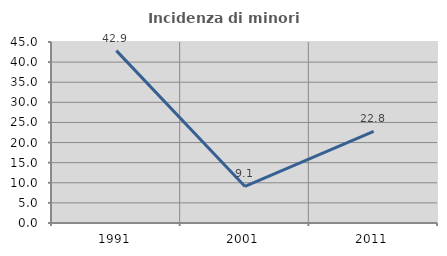
| Category | Incidenza di minori stranieri |
|---|---|
| 1991.0 | 42.857 |
| 2001.0 | 9.091 |
| 2011.0 | 22.778 |